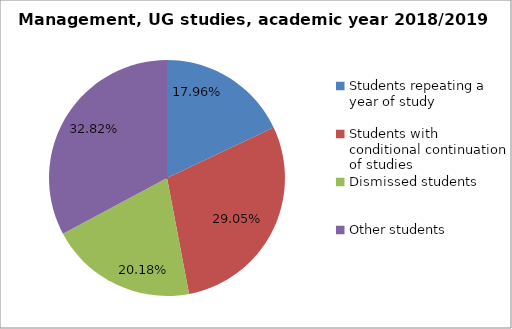
| Category | Series 0 |
|---|---|
| Students repeating a year of study | 81 |
| Students with conditional continuation of studies | 131 |
| Dismissed students | 91 |
| Other students | 148 |